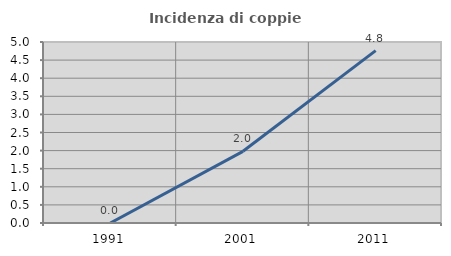
| Category | Incidenza di coppie miste |
|---|---|
| 1991.0 | 0 |
| 2001.0 | 1.98 |
| 2011.0 | 4.762 |